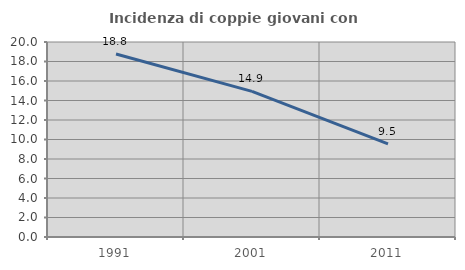
| Category | Incidenza di coppie giovani con figli |
|---|---|
| 1991.0 | 18.767 |
| 2001.0 | 14.932 |
| 2011.0 | 9.545 |